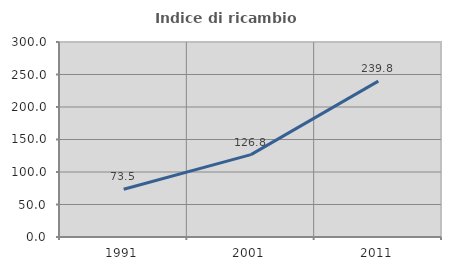
| Category | Indice di ricambio occupazionale  |
|---|---|
| 1991.0 | 73.469 |
| 2001.0 | 126.772 |
| 2011.0 | 239.785 |